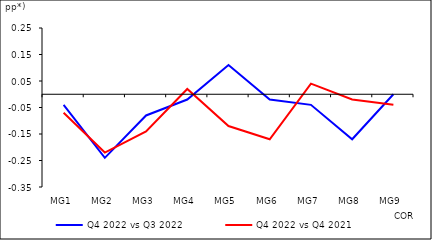
| Category | Q4 2022 vs Q3 2022 | Q4 2022 vs Q4 2021 |
|---|---|---|
| MG1 | -0.04 | -0.07 |
| MG2 | -0.24 | -0.22 |
| MG3 | -0.08 | -0.14 |
| MG4 | -0.02 | 0.02 |
| MG5 | 0.11 | -0.12 |
| MG6 | -0.02 | -0.17 |
| MG7 | -0.04 | 0.04 |
| MG8 | -0.17 | -0.02 |
| MG9 | 0 | -0.04 |